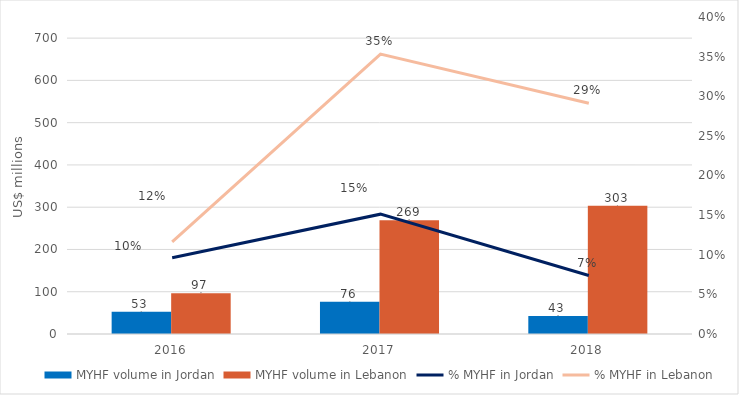
| Category | MYHF volume in Jordan | MYHF volume in Lebanon |
|---|---|---|
| 2016.0 | 52.502 | 96.504 |
| 2017.0 | 76.102 | 269.216 |
| 2018.0 | 42.606 | 303.444 |